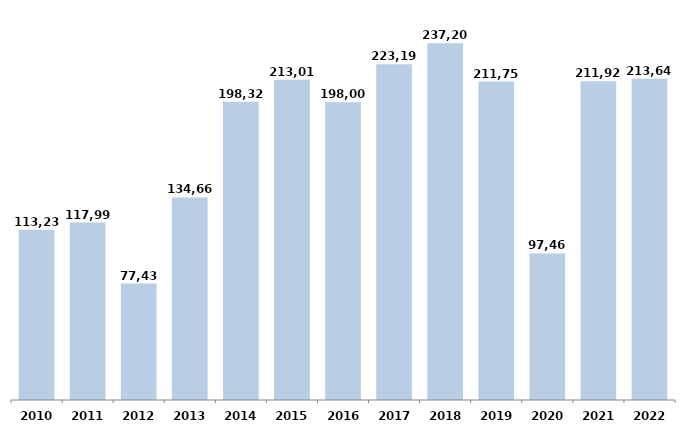
| Category | Series 0 |
|---|---|
| 2010 | 113237.28 |
| 2011 | 117989.9 |
| 2012 | 77431.15 |
| 2013 | 134660.28 |
| 2014 | 198320.28 |
| 2015 | 213014.5 |
| 2016 | 198003.93 |
| 2017 | 223191.89 |
| 2018 | 237206.96 |
| 2019 | 211751.705 |
| 2020 | 97462 |
| 2021 | 211923 |
| 2022 | 213642.821 |